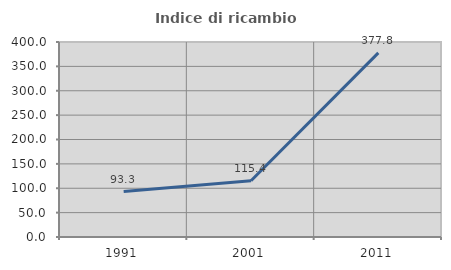
| Category | Indice di ricambio occupazionale  |
|---|---|
| 1991.0 | 93.333 |
| 2001.0 | 115.385 |
| 2011.0 | 377.778 |